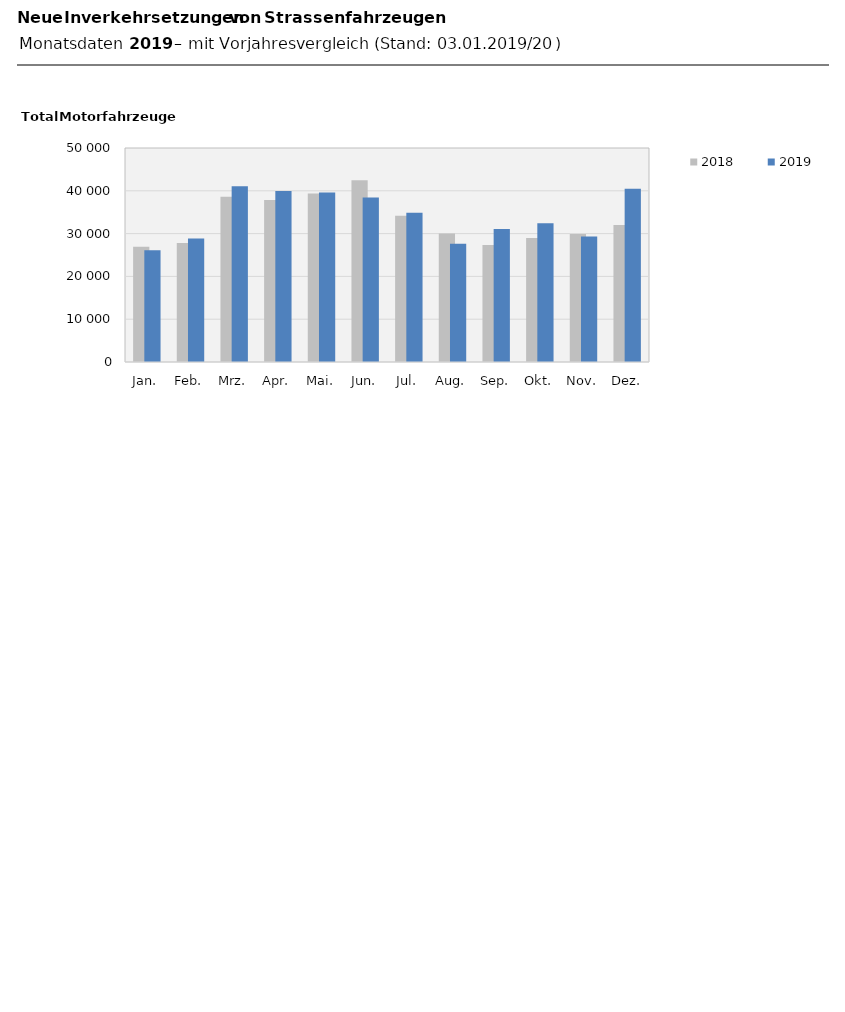
| Category | 2018 | 2019 |
|---|---|---|
| Jan. | 26923 | 26097 |
| Feb. | 27829 | 28838 |
| Mrz. | 38587 | 41038 |
| Apr. | 37846 | 39963 |
| Mai. | 39349 | 39625 |
| Jun. | 42480 | 38458 |
| Jul. | 34171 | 34896 |
| Aug. | 30026 | 27632 |
| Sep. | 27310 | 31087 |
| Okt. | 28966 | 32408 |
| Nov. | 29910 | 29327 |
| Dez. | 32016 | 40507 |